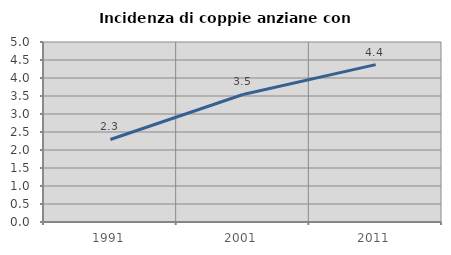
| Category | Incidenza di coppie anziane con figli |
|---|---|
| 1991.0 | 2.293 |
| 2001.0 | 3.543 |
| 2011.0 | 4.371 |